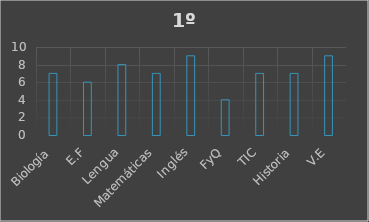
| Category | Series 0 |
|---|---|
| Biología | 7 |
| E.F | 6 |
| Lengua | 8 |
| Matemáticas | 7 |
| Inglés | 9 |
| FyQ | 4 |
| TIC | 7 |
| Historia | 7 |
| V.E | 9 |